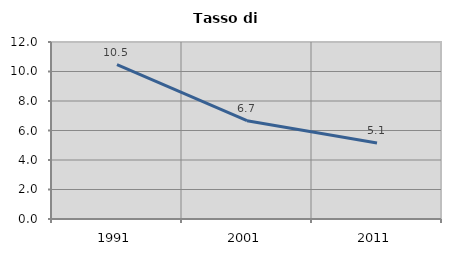
| Category | Tasso di disoccupazione   |
|---|---|
| 1991.0 | 10.459 |
| 2001.0 | 6.664 |
| 2011.0 | 5.147 |